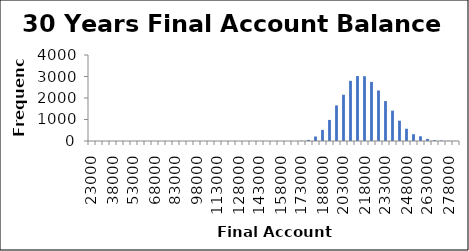
| Category | Frequency |
|---|---|
| 23000.0 | 0 |
| 28000.0 | 0 |
| 33000.0 | 0 |
| 38000.0 | 0 |
| 43000.0 | 0 |
| 48000.0 | 0 |
| 53000.0 | 0 |
| 58000.0 | 0 |
| 63000.0 | 0 |
| 68000.0 | 0 |
| 73000.0 | 0 |
| 78000.0 | 0 |
| 83000.0 | 0 |
| 88000.0 | 0 |
| 93000.0 | 0 |
| 98000.0 | 0 |
| 103000.0 | 0 |
| 108000.0 | 0 |
| 113000.0 | 0 |
| 118000.0 | 0 |
| 123000.0 | 0 |
| 128000.0 | 0 |
| 133000.0 | 0 |
| 138000.0 | 0 |
| 143000.0 | 0 |
| 148000.0 | 0 |
| 153000.0 | 0 |
| 158000.0 | 0 |
| 163000.0 | 1 |
| 168000.0 | 0 |
| 173000.0 | 14 |
| 178000.0 | 50 |
| 183000.0 | 209 |
| 188000.0 | 517 |
| 193000.0 | 982 |
| 198000.0 | 1657 |
| 203000.0 | 2150 |
| 208000.0 | 2798 |
| 213000.0 | 3020 |
| 218000.0 | 3013 |
| 223000.0 | 2748 |
| 228000.0 | 2350 |
| 233000.0 | 1857 |
| 238000.0 | 1411 |
| 243000.0 | 944 |
| 248000.0 | 570 |
| 253000.0 | 315 |
| 258000.0 | 218 |
| 263000.0 | 96 |
| 268000.0 | 41 |
| 273000.0 | 25 |
| 278000.0 | 10 |
| More | 4 |